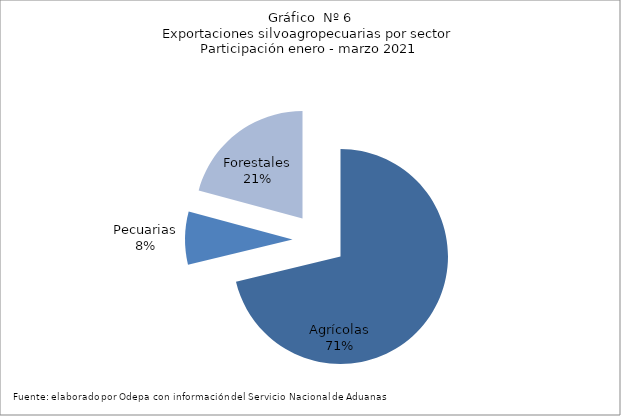
| Category | Series 0 |
|---|---|
| Agrícolas | 3563657 |
| Pecuarias | 397135 |
| Forestales | 1041247 |